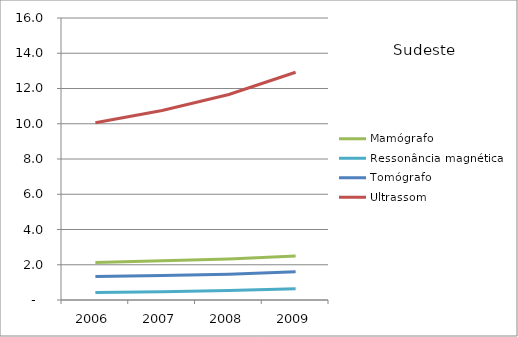
| Category | Mamógrafo | Ressonância magnética | Tomógrafo | Ultrassom |
|---|---|---|---|---|
| 2006.0 | 2.13 | 0.43 | 1.34 | 10.06 |
| 2007.0 | 2.22 | 0.47 | 1.39 | 10.75 |
| 2008.0 | 2.32 | 0.54 | 1.46 | 11.66 |
| 2009.0 | 2.49 | 0.64 | 1.6 | 12.92 |